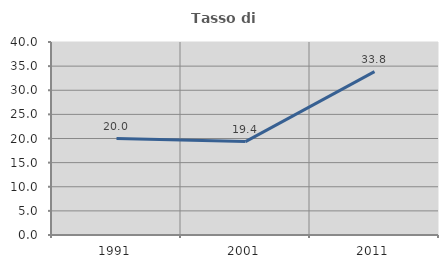
| Category | Tasso di occupazione   |
|---|---|
| 1991.0 | 20 |
| 2001.0 | 19.355 |
| 2011.0 | 33.846 |